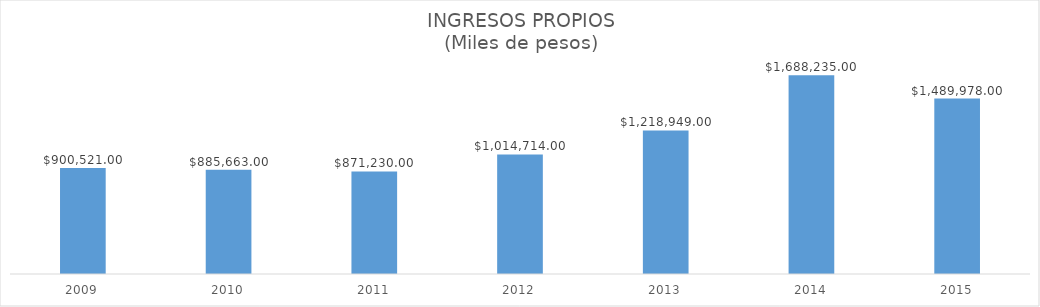
| Category | INGRESOS PROPIOS |
|---|---|
| 2009.0 | 900521 |
| 2010.0 | 885663 |
| 2011.0 | 871230 |
| 2012.0 | 1014714 |
| 2013.0 | 1218949 |
| 2014.0 | 1688235 |
| 2015.0 | 1489978 |